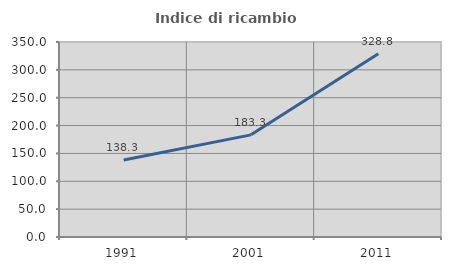
| Category | Indice di ricambio occupazionale  |
|---|---|
| 1991.0 | 138.25 |
| 2001.0 | 183.333 |
| 2011.0 | 328.792 |